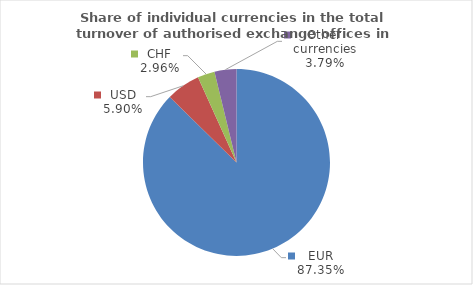
| Category | Series 0 |
|---|---|
| EUR | 87.349 |
| USD | 5.896 |
| CHF | 2.964 |
| Other currencies | 3.79 |